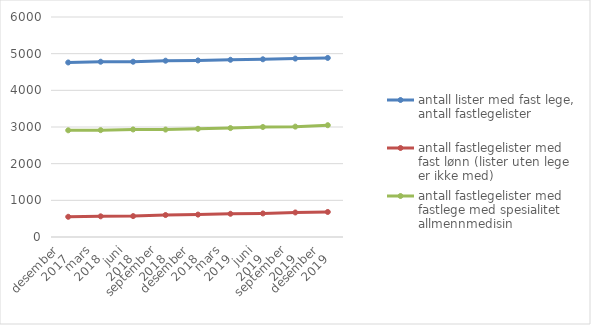
| Category | antall lister med fast lege, antall fastlegelister | antall fastlegelister med fast lønn (lister uten lege er ikke med) | antall fastlegelister med fastlege med spesialitet allmennmedisin |
|---|---|---|---|
| 0 | 4760 | 551 | 2910 |
| 1 | 4780 | 564 | 2914 |
| 2 | 4780 | 570 | 2933 |
| 3 | 4808 | 599 | 2930 |
| 4 | 4815 | 611 | 2950 |
| 5 | 4833 | 633 | 2971 |
| 6 | 4847 | 642 | 3000 |
| 7 | 4866 | 669 | 3010 |
| 8 | 4884 | 683 | 3049 |